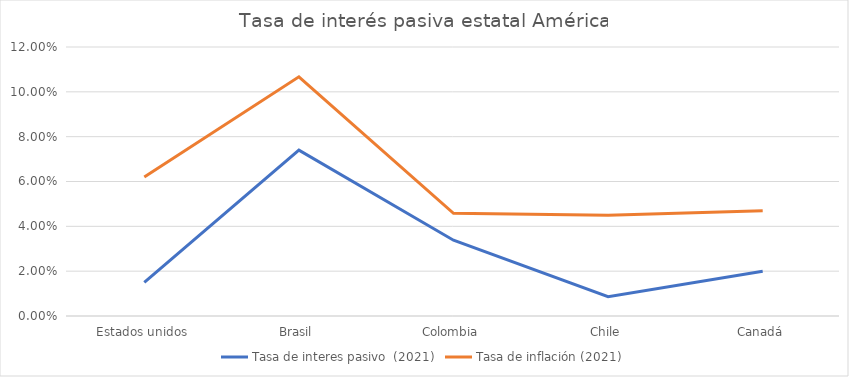
| Category | Tasa de interes pasivo  (2021) | Tasa de inflación (2021) |
|---|---|---|
| Estados unidos | 0.015 | 0.062 |
| Brasil | 0.074 | 0.107 |
| Colombia | 0.034 | 0.046 |
| Chile | 0.009 | 0.045 |
| Canadá | 0.02 | 0.047 |